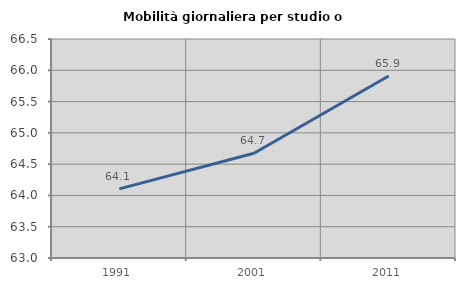
| Category | Mobilità giornaliera per studio o lavoro |
|---|---|
| 1991.0 | 64.104 |
| 2001.0 | 64.674 |
| 2011.0 | 65.909 |